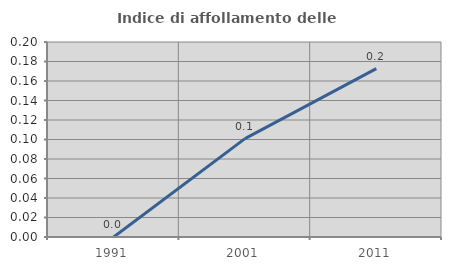
| Category | Indice di affollamento delle abitazioni  |
|---|---|
| 1991.0 | 0 |
| 2001.0 | 0.101 |
| 2011.0 | 0.173 |